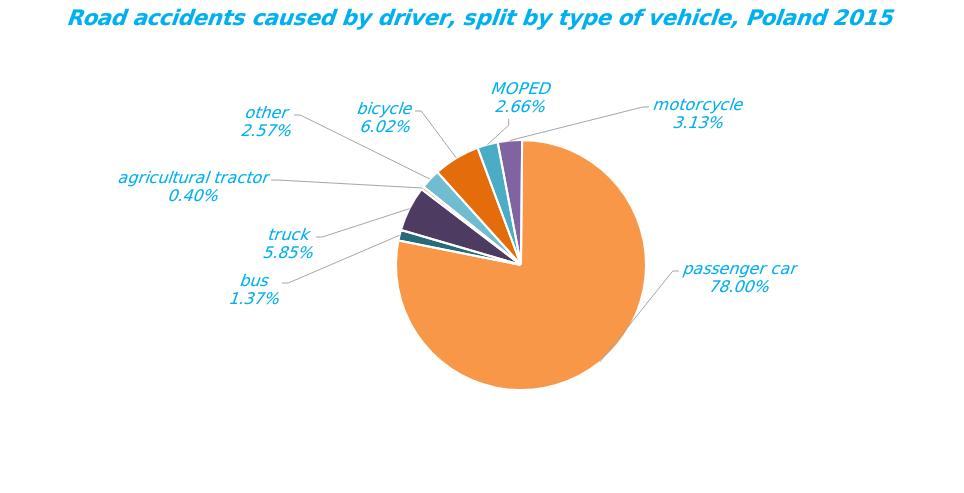
| Category | Series 0 |
|---|---|
| bicycle | 1644 |
| MOPED | 726 |
| motorcycle | 855 |
| passenger car | 21299 |
| bus | 373 |
| truck | 1598 |
| agricultural tractor | 110 |
| other | 702 |